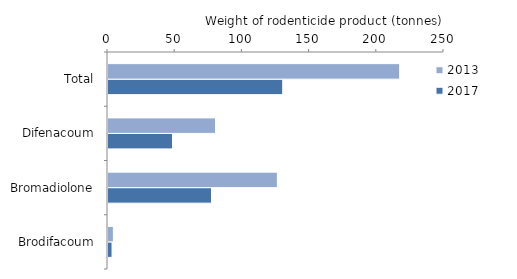
| Category | 2017 | 2013 |
|---|---|---|
| Brodifacoum | 3 | 4 |
| Bromadiolone | 77 | 126 |
| Difenacoum | 48 | 80 |
| Total | 130 | 217 |